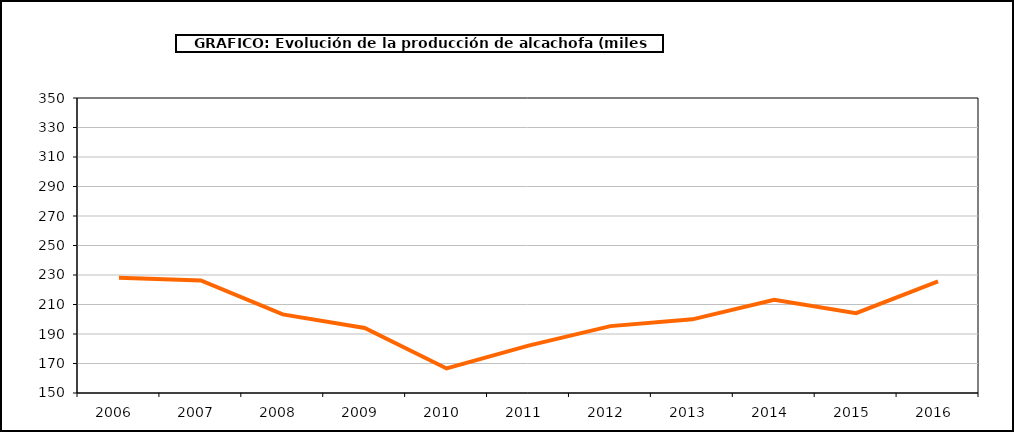
| Category | producción |
|---|---|
| 2006.0 | 228.219 |
| 2007.0 | 226.281 |
| 2008.0 | 203.301 |
| 2009.0 | 194.099 |
| 2010.0 | 166.662 |
| 2011.0 | 182.1 |
| 2012.0 | 195.342 |
| 2013.0 | 199.945 |
| 2014.0 | 213.258 |
| 2015.0 | 204.111 |
| 2016.0 | 225.616 |